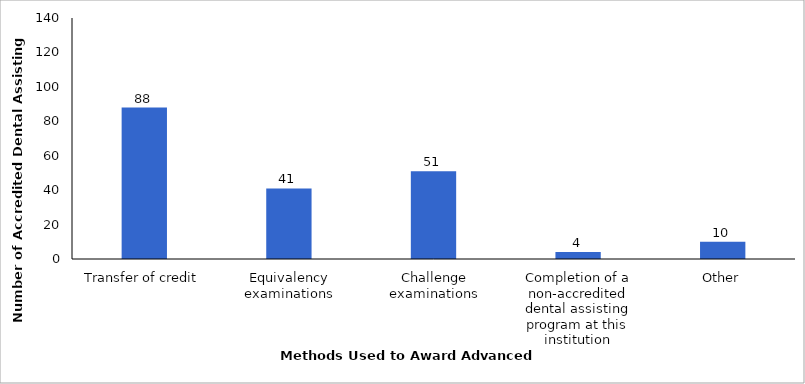
| Category | 2015-16 |
|---|---|
| Transfer of credit | 88 |
| Equivalency examinations | 41 |
| Challenge examinations | 51 |
| Completion of a non-accredited dental assisting program at this institution | 4 |
| Other | 10 |